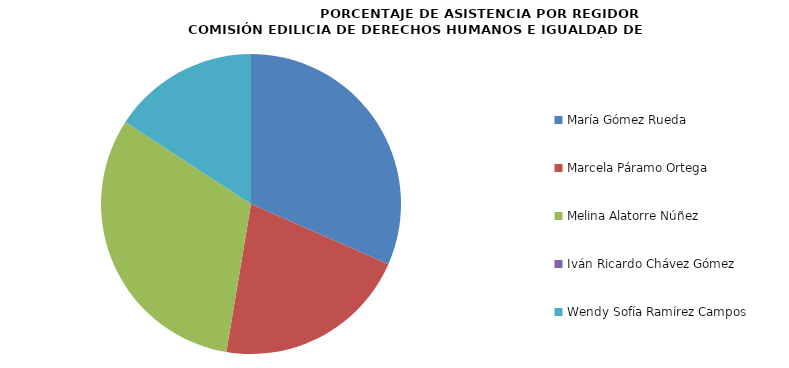
| Category | Series 0 |
|---|---|
| María Gómez Rueda | 100 |
| Marcela Páramo Ortega | 66.667 |
| Melina Alatorre Núñez | 100 |
| Iván Ricardo Chávez Gómez | 0 |
| Wendy Sofía Ramírez Campos | 50 |